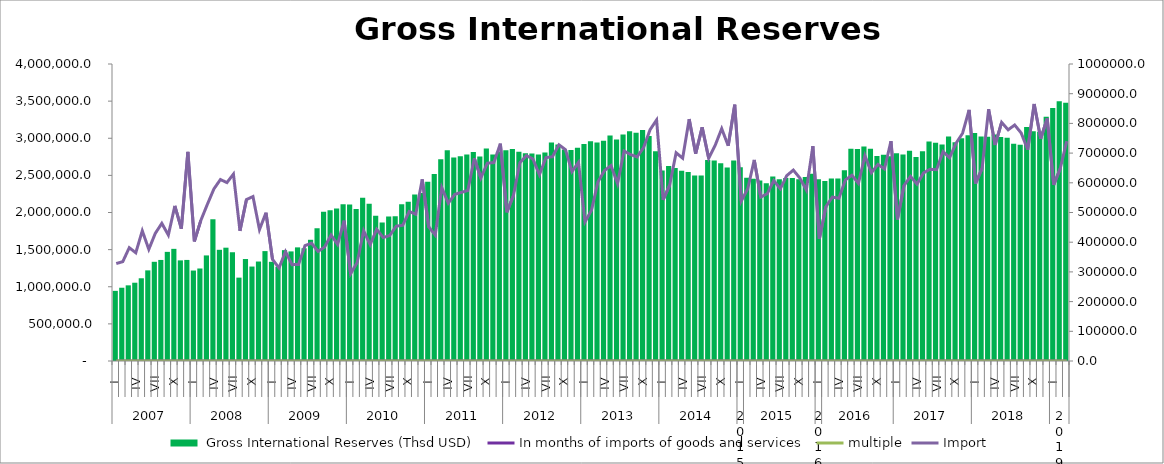
| Category |  Gross International Reserves (Thsd USD) |
|---|---|
| 0 | 944569.356 |
| 1 | 986716.087 |
| 2 | 1018970.638 |
| 3 | 1054278.365 |
| 4 | 1114160.468 |
| 5 | 1220729.487 |
| 6 | 1336062.499 |
| 7 | 1360970.198 |
| 8 | 1469799.647 |
| 9 | 1510431.083 |
| 10 | 1355160.588 |
| 11 | 1361139.94 |
| 12 | 1218380.992 |
| 13 | 1245880.818 |
| 14 | 1421919.99 |
| 15 | 1910253.845 |
| 16 | 1497582.718 |
| 17 | 1526134.644 |
| 18 | 1464749.428 |
| 19 | 1122855.834 |
| 20 | 1373330.153 |
| 21 | 1272102.001 |
| 22 | 1339757.483 |
| 23 | 1480157.563 |
| 24 | 1335830.434 |
| 25 | 1269325.862 |
| 26 | 1493108.058 |
| 27 | 1476027.716 |
| 28 | 1530375.506 |
| 29 | 1518203.703 |
| 30 | 1632579.525 |
| 31 | 1788341.435 |
| 32 | 2009955.589 |
| 33 | 2030508.619 |
| 34 | 2052635.598 |
| 35 | 2110413.479 |
| 36 | 2106203.981 |
| 37 | 2046269.085 |
| 38 | 2199234.144 |
| 39 | 2116174.036 |
| 40 | 1957092.26 |
| 41 | 1864408.87 |
| 42 | 1947257.286 |
| 43 | 1948646.735 |
| 44 | 2110240.516 |
| 45 | 2143452.411 |
| 46 | 2243098.08 |
| 47 | 2263931.003 |
| 48 | 2413276.234 |
| 49 | 2519379.834 |
| 50 | 2717701.26 |
| 51 | 2838315.136 |
| 52 | 2741576.745 |
| 53 | 2759253.793 |
| 54 | 2782237.942 |
| 55 | 2813452.719 |
| 56 | 2755211.768 |
| 57 | 2861887.778 |
| 58 | 2780195.98 |
| 59 | 2818259.268 |
| 60 | 2839594.988 |
| 61 | 2856750.893 |
| 62 | 2816704.829 |
| 63 | 2798459.455 |
| 64 | 2793387.554 |
| 65 | 2780985.069 |
| 66 | 2807413.792 |
| 67 | 2943749.499 |
| 68 | 2914658.817 |
| 69 | 2849332.726 |
| 70 | 2841471.603 |
| 71 | 2872974.007 |
| 72 | 2920913.483 |
| 73 | 2960164.648 |
| 74 | 2941281.374 |
| 75 | 2967640.231 |
| 76 | 3038439.423 |
| 77 | 2981696.572 |
| 78 | 3048940.273 |
| 79 | 3094880.401 |
| 80 | 3074514.403 |
| 81 | 3110052.596 |
| 82 | 3030762.59 |
| 83 | 2823422.31 |
| 84 | 2566485.807 |
| 85 | 2625815.897 |
| 86 | 2598611.489 |
| 87 | 2561530.614 |
| 88 | 2546888.469 |
| 89 | 2498141.455 |
| 90 | 2499536.21 |
| 91 | 2707900.374 |
| 92 | 2701161.577 |
| 93 | 2661929.063 |
| 94 | 2607504.967 |
| 95 | 2699187.561 |
| 96 | 2610108.469 |
| 97 | 2469434.991 |
| 98 | 2452879.825 |
| 99 | 2430898.174 |
| 100 | 2393461.564 |
| 101 | 2483749.819 |
| 102 | 2447135.694 |
| 103 | 2463246.038 |
| 104 | 2464305.635 |
| 105 | 2448949.349 |
| 106 | 2479433.026 |
| 107 | 2520576.458 |
| 108 | 2447473.906 |
| 109 | 2425874.122 |
| 110 | 2456678.704 |
| 111 | 2456757.547 |
| 112 | 2569385.763 |
| 113 | 2857243.993 |
| 114 | 2856372.165 |
| 115 | 2888476.122 |
| 116 | 2858235.696 |
| 117 | 2760196.146 |
| 118 | 2779157.145 |
| 119 | 2757417.107 |
| 120 | 2797144.593 |
| 121 | 2781130.045 |
| 122 | 2832873.183 |
| 123 | 2745865.823 |
| 124 | 2826021.753 |
| 125 | 2956463.581 |
| 126 | 2938356.066 |
| 127 | 2915223.788 |
| 128 | 3025040.952 |
| 129 | 2945349.028 |
| 130 | 2999154.228 |
| 131 | 3038994.561 |
| 132 | 3069440.177 |
| 133 | 3022556.548 |
| 134 | 3019418.473 |
| 135 | 3049424.102 |
| 136 | 3015678.434 |
| 137 | 3005134.527 |
| 138 | 2925530.517 |
| 139 | 2911383.682 |
| 140 | 3152589.591 |
| 141 | 3095226.794 |
| 142 | 3088515.907 |
| 143 | 3289847.643 |
| 144 | 3405736.15 |
| 145 | 3496829.339 |
| 146 | 3478578.15 |